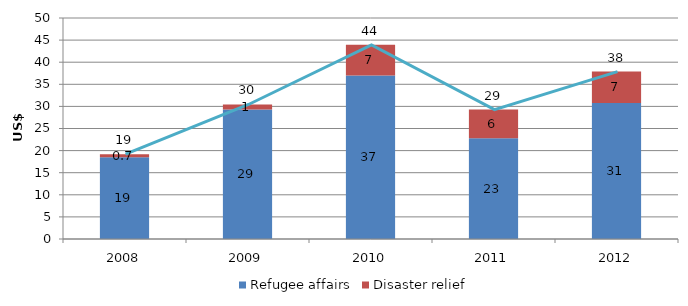
| Category | Refugee affairs | Disaster relief |
|---|---|---|
| 2008.0 | 18.513 | 0.673 |
| 2009.0 | 29.307 | 1.128 |
| 2010.0 | 36.999 | 6.933 |
| 2011.0 | 22.773 | 6.499 |
| 2012.0 | 30.795 | 7.078 |